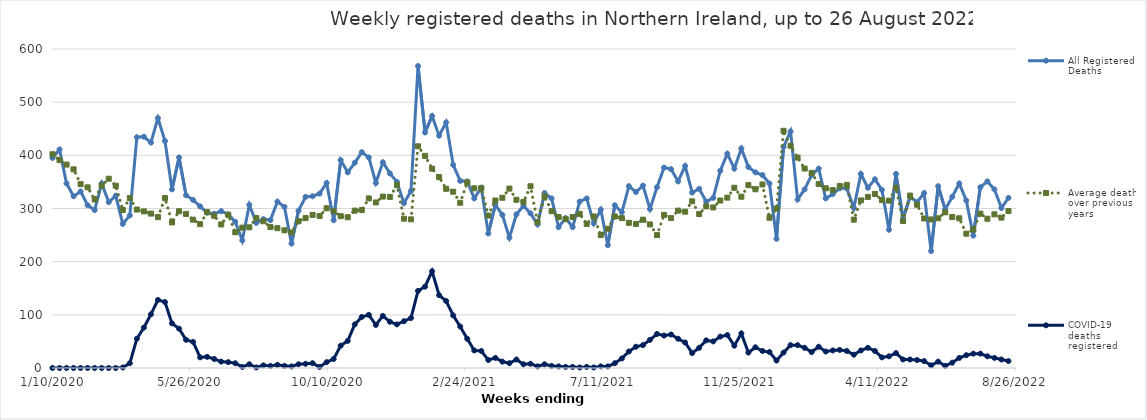
| Category | All Registered Deaths | Average deaths over previous 5 years | COVID-19 deaths registered |
|---|---|---|---|
| 1/10/20 | 395 | 402 | 0 |
| 1/17/20 | 411 | 391 | 0 |
| 1/24/20 | 347 | 382.6 | 0 |
| 1/31/20 | 323 | 373.6 | 0 |
| 2/7/20 | 332 | 345.8 | 0 |
| 2/14/20 | 306 | 339.8 | 0 |
| 2/21/20 | 297 | 317 | 0 |
| 2/28/20 | 347 | 343 | 0 |
| 3/6/20 | 312 | 356 | 0 |
| 3/13/20 | 324 | 342.8 | 0 |
| 3/20/20 | 271 | 297.2 | 1 |
| 3/27/20 | 287 | 319.6 | 9 |
| 4/3/20 | 434 | 298 | 55 |
| 4/10/20 | 435 | 294.6 | 76 |
| 4/17/20 | 424 | 290.4 | 101 |
| 4/24/20 | 470 | 283.8 | 128 |
| 5/1/20 | 427 | 319.6 | 124 |
| 5/8/20 | 336 | 273.8 | 84 |
| 5/15/20 | 396 | 294.8 | 74 |
| 5/22/20 | 325 | 289.8 | 53 |
| 5/29/20 | 316 | 279 | 49 |
| 6/5/20 | 304 | 270.6 | 20 |
| 6/12/20 | 292 | 293.2 | 21 |
| 6/19/20 | 290 | 286.4 | 17 |
| 6/26/20 | 295 | 270 | 12 |
| 7/3/20 | 289 | 288.2 | 11 |
| 7/10/20 | 275 | 255.2 | 9 |
| 7/17/20 | 240 | 264 | 2 |
| 7/24/20 | 307 | 264.6 | 7 |
| 7/31/20 | 273 | 282 | 1 |
| 8/7/20 | 280 | 276 | 5 |
| 8/14/20 | 278 | 265 | 4 |
| 8/21/20 | 313 | 263 | 6 |
| 8/28/20 | 303 | 259 | 4 |
| 9/4/20 | 234 | 255 | 3 |
| 9/11/20 | 296 | 276 | 7 |
| 9/18/20 | 322 | 282 | 8 |
| 9/25/20 | 323 | 288 | 9 |
| 10/2/20 | 328 | 286 | 2 |
| 10/9/20 | 348 | 300.4 | 11 |
| 10/16/20 | 278 | 294.8 | 17 |
| 10/23/20 | 391 | 285.6 | 42 |
| 10/30/20 | 368 | 283.6 | 51 |
| 11/6/20 | 386 | 296 | 82 |
| 11/13/20 | 406 | 297 | 96 |
| 11/20/20 | 396 | 319 | 100 |
| 11/27/20 | 348 | 311.4 | 81 |
| 12/4/20 | 387 | 322.4 | 98 |
| 12/11/20 | 366 | 321.8 | 87 |
| 12/18/20 | 350 | 343.8 | 82 |
| 12/25/20 | 310 | 280.8 | 88 |
| 1/1/21 | 333 | 279.6 | 94 |
| 1/8/21 | 568 | 417 | 145 |
| 1/15/21 | 443 | 399 | 153 |
| 1/22/21 | 474 | 375 | 182 |
| 1/29/21 | 437 | 359 | 137 |
| 2/5/21 | 462 | 337 | 126 |
| 2/12/21 | 382 | 331.6 | 99 |
| 2/19/21 | 352 | 310.8 | 78 |
| 2/26/21 | 351 | 349 | 55 |
| 3/5/21 | 319 | 338 | 33 |
| 3/12/21 | 339 | 338 | 32 |
| 3/19/21 | 253 | 286.8 | 15 |
| 3/26/21 | 307 | 315 | 19 |
| 4/2/21 | 288 | 320.2 | 12 |
| 4/9/21 | 245 | 337.4 | 9 |
| 4/16/21 | 289 | 316.4 | 16 |
| 4/23/21 | 305 | 312.4 | 7 |
| 4/30/21 | 291 | 341.8 | 8 |
| 5/7/21 | 270 | 274 | 3 |
| 5/14/21 | 329 | 323 | 7 |
| 5/21/21 | 319 | 295 | 4 |
| 5/28/21 | 265 | 284 | 3 |
| 6/4/21 | 282 | 280 | 2 |
| 6/11/21 | 265 | 284 | 2 |
| 6/18/21 | 313 | 290 | 1 |
| 6/25/21 | 319 | 271 | 2 |
| 7/2/21 | 272 | 285 | 1 |
| 7/9/21 | 298 | 250 | 3 |
| 7/16/21 | 231 | 262 | 3 |
| 7/23/21 | 306 | 285 | 9 |
| 7/30/21 | 293 | 282 | 18 |
| 8/6/21 | 342 | 273 | 31 |
| 8/13/21 | 331 | 271 | 40 |
| 8/20/21 | 343 | 279 | 43 |
| 8/27/21 | 299 | 270 | 53 |
| 9/3/21 | 340 | 250 | 64 |
| 9/10/21 | 377 | 288 | 61 |
| 9/17/21 | 374 | 282 | 63 |
| 9/24/21 | 351 | 296 | 55 |
| 10/1/21 | 380 | 294 | 48 |
| 10/8/21 | 330 | 313.6 | 28 |
| 10/15/21 | 337 | 289.6 | 38 |
| 10/22/21 | 313 | 304 | 52 |
| 10/29/21 | 320 | 302 | 50 |
| 11/5/21 | 371 | 315 | 59 |
| 11/12/21 | 403 | 320.4 | 62 |
| 11/19/21 | 375 | 339 | 42 |
| 11/26/21 | 413 | 322.2 | 65 |
| 12/3/21 | 378 | 344 | 29 |
| 12/10/21 | 368 | 336.2 | 39 |
| 12/17/21 | 363 | 345.2 | 32 |
| 12/24/21 | 347 | 282.6 | 30 |
| 12/31/21 | 243 | 299.8 | 14 |
| 1/7/22 | 416 | 446.2 | 29 |
| 1/14/22 | 445 | 418 | 43 |
| 1/21/22 | 317 | 395.8 | 43 |
| 1/28/22 | 336 | 375.2 | 38 |
| 2/4/22 | 363 | 367 | 30 |
| 2/11/22 | 375 | 346 | 40 |
| 2/18/22 | 319 | 338 | 31 |
| 2/25/22 | 327 | 334.6 | 33 |
| 3/4/22 | 338 | 342.4 | 34 |
| 3/11/22 | 338 | 344.4 | 32 |
| 3/18/22 | 301 | 279 | 25 |
| 3/25/22 | 365 | 315.2 | 33 |
| 4/1/22 | 339 | 321.8 | 38 |
| 4/8/22 | 355 | 327.4 | 32 |
| 4/15/22 | 335 | 315.8 | 20 |
| 4/22/22 | 260 | 314.8 | 22 |
| 4/29/22 | 365 | 338.8 | 28 |
| 5/6/22 | 281 | 276.4 | 16 |
| 5/13/22 | 322 | 324.4 | 16 |
| 5/20/22 | 312 | 307 | 15 |
| 5/27/22 | 329 | 281.2 | 13 |
| 6/3/22 | 220 | 279.4 | 5 |
| 6/10/22 | 342 | 281.6 | 12 |
| 6/17/22 | 298 | 292.8 | 4 |
| 6/24/22 | 322 | 284 | 10 |
| 7/1/22 | 347 | 281.6 | 19 |
| 7/8/22 | 315 | 252.6 | 24 |
| 7/15/22 | 249 | 260.4 | 27 |
| 7/22/22 | 340 | 290.4 | 27 |
| 7/29/22 | 351 | 280.8 | 22 |
| 8/5/22 | 336 | 289 | 19 |
| 8/12/22 | 301 | 282.8 | 16 |
| 8/19/22 | 320 | 295.2 | 13 |